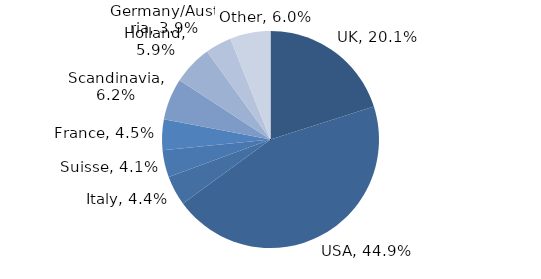
| Category | Investment Style |
|---|---|
| UK | 0.201 |
| USA | 0.449 |
| Italy | 0.044 |
| Suisse | 0.041 |
| France | 0.045 |
| Scandinavia | 0.062 |
| Holland | 0.059 |
| Germany/Austria | 0.039 |
| Other | 0.06 |